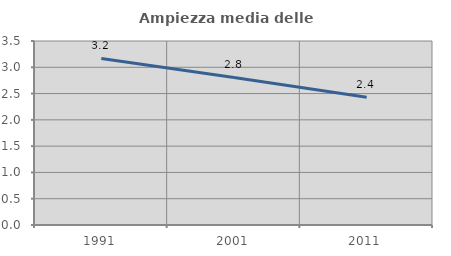
| Category | Ampiezza media delle famiglie |
|---|---|
| 1991.0 | 3.168 |
| 2001.0 | 2.806 |
| 2011.0 | 2.43 |